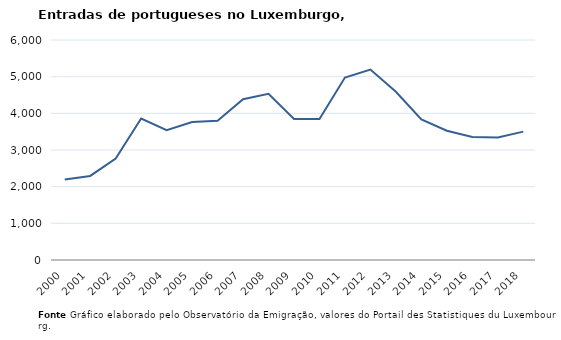
| Category | Entradas |
|---|---|
| 2000.0 | 2193 |
| 2001.0 | 2293 |
| 2002.0 | 2767 |
| 2003.0 | 3857 |
| 2004.0 | 3542 |
| 2005.0 | 3761 |
| 2006.0 | 3796 |
| 2007.0 | 4385 |
| 2008.0 | 4531 |
| 2009.0 | 3844 |
| 2010.0 | 3845 |
| 2011.0 | 4977 |
| 2012.0 | 5193 |
| 2013.0 | 4590 |
| 2014.0 | 3832 |
| 2015.0 | 3525 |
| 2016.0 | 3355 |
| 2017.0 | 3342 |
| 2018.0 | 3501 |